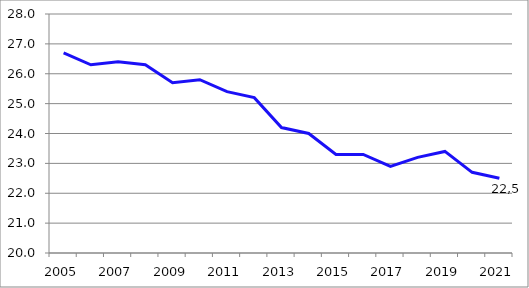
| Category | Series 1 |
|---|---|
| 2005.0 | 26.7 |
| 2006.0 | 26.3 |
| 2007.0 | 26.4 |
| 2008.0 | 26.3 |
| 2009.0 | 25.7 |
| 2010.0 | 25.8 |
| 2011.0 | 25.4 |
| 2012.0 | 25.2 |
| 2013.0 | 24.2 |
| 2014.0 | 24 |
| 2015.0 | 23.3 |
| 2016.0 | 23.3 |
| 2017.0 | 22.9 |
| 2018.0 | 23.2 |
| 2019.0 | 23.4 |
| 2020.0 | 22.7 |
| 2021.0 | 22.5 |